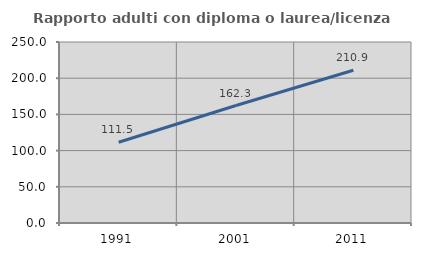
| Category | Rapporto adulti con diploma o laurea/licenza media  |
|---|---|
| 1991.0 | 111.546 |
| 2001.0 | 162.255 |
| 2011.0 | 210.911 |